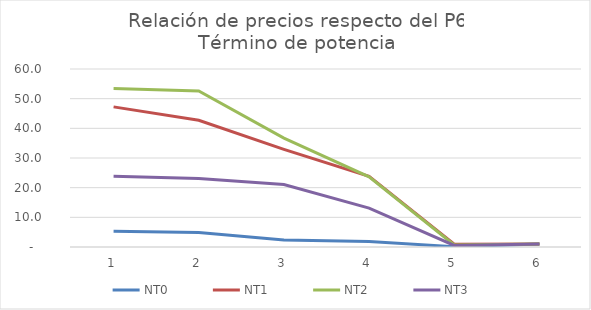
| Category | NT0 | NT1 | NT2 | NT3 |
|---|---|---|---|---|
| 0 | 5.349 | 47.231 | 53.44 | 23.868 |
| 1 | 4.875 | 42.723 | 52.612 | 23.076 |
| 2 | 2.339 | 32.913 | 36.72 | 21.033 |
| 3 | 1.858 | 23.797 | 23.661 | 13.121 |
| 4 | 0.11 | 0.928 | 0.669 | 0.508 |
| 5 | 1 | 1 | 1 | 1 |